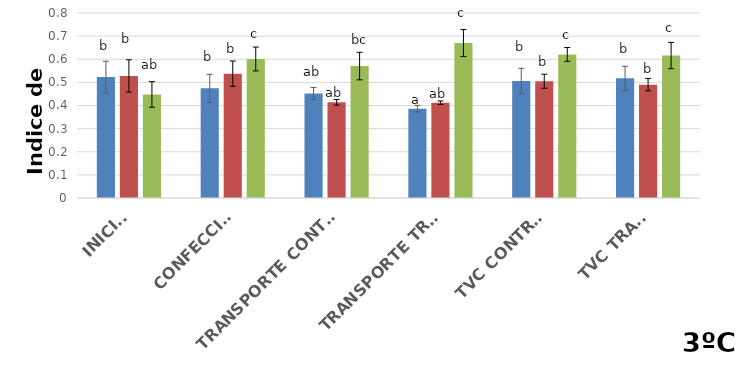
| Category | Black Splendor | Showtime | Black Gold |
|---|---|---|---|
| INICIAL | 0.523 | 0.528 | 0.448 |
| CONFECCIÓN | 0.474 | 0.538 | 0.601 |
|  TRANSPORTE CONTROL | 0.452 | 0.414 | 0.571 |
| TRANSPORTE TRAT. | 0.386 | 0.412 | 0.67 |
| TVC CONTROL | 0.506 | 0.505 | 0.621 |
| TVC TRAT. | 0.517 | 0.49 | 0.616 |